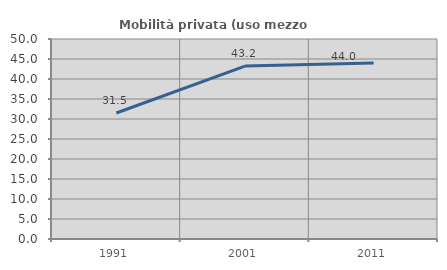
| Category | Mobilità privata (uso mezzo privato) |
|---|---|
| 1991.0 | 31.508 |
| 2001.0 | 43.239 |
| 2011.0 | 43.983 |